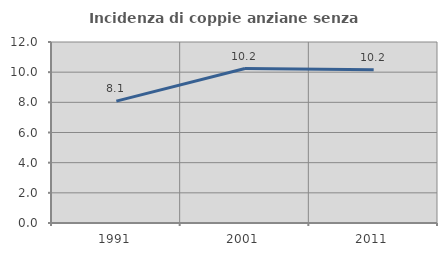
| Category | Incidenza di coppie anziane senza figli  |
|---|---|
| 1991.0 | 8.082 |
| 2001.0 | 10.242 |
| 2011.0 | 10.161 |